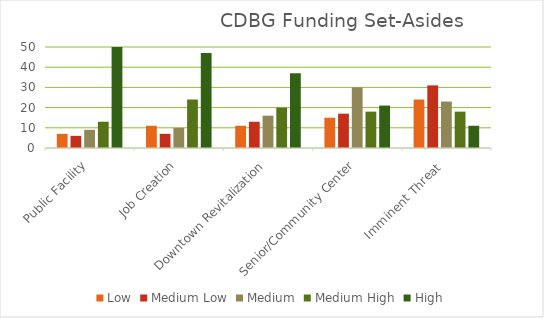
| Category | Low | Medium Low | Medium | Medium High | High |
|---|---|---|---|---|---|
| Public Facility | 7 | 6 | 9 | 13 | 61 |
| Job Creation | 11 | 7 | 10 | 24 | 47 |
| Downtown Revitalization | 11 | 13 | 16 | 20 | 37 |
| Senior/Community Center | 15 | 17 | 30 | 18 | 21 |
| Imminent Threat  | 24 | 31 | 23 | 18 | 11 |